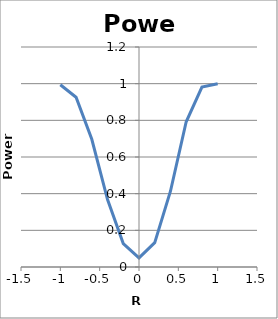
| Category | Series 0 |
|---|---|
| -1.0 | 0.994 |
| -0.8 | 0.926 |
| -0.6000000000000001 | 0.697 |
| -0.4000000000000001 | 0.368 |
| -0.20000000000000007 | 0.128 |
| 0.0 | 0.05 |
| 0.2 | 0.133 |
| 0.4 | 0.413 |
| 0.6000000000000001 | 0.792 |
| 0.8 | 0.981 |
| 1.0 | 1 |